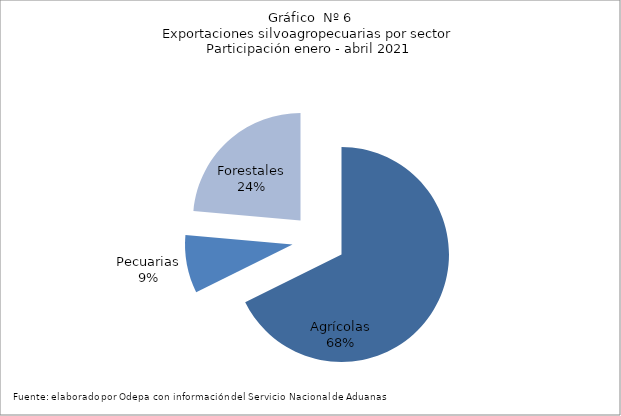
| Category | Series 0 |
|---|---|
| Agrícolas | 4443557 |
| Pecuarias | 573852 |
| Forestales | 1548477 |